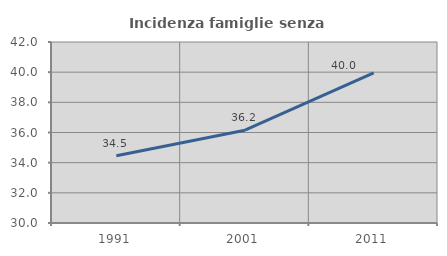
| Category | Incidenza famiglie senza nuclei |
|---|---|
| 1991.0 | 34.464 |
| 2001.0 | 36.154 |
| 2011.0 | 39.961 |